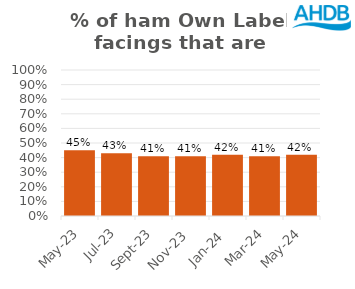
| Category | Ham |
|---|---|
| 2023-05-01 | 0.45 |
| 2023-07-01 | 0.43 |
| 2023-09-01 | 0.41 |
| 2023-11-01 | 0.41 |
| 2024-01-01 | 0.42 |
| 2024-03-01 | 0.41 |
| 2024-05-01 | 0.42 |